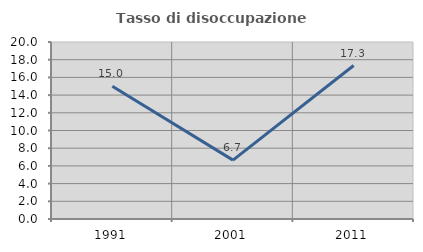
| Category | Tasso di disoccupazione giovanile  |
|---|---|
| 1991.0 | 14.993 |
| 2001.0 | 6.652 |
| 2011.0 | 17.343 |